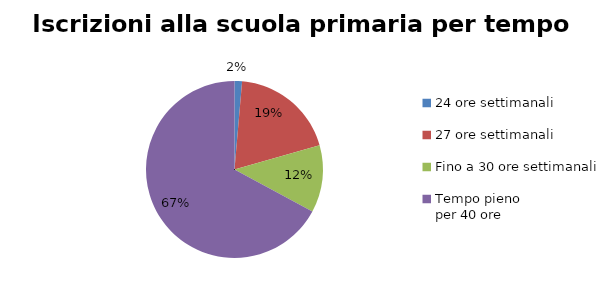
| Category | Series 1 | Series 0 |
|---|---|---|
| 24 ore settimanali | 805 | 805 |
| 27 ore settimanali | 11257 | 11257 |
| Fino a 30 ore settimanali | 7215 | 7215 |
| Tempo pieno 
per 40 ore | 39342 | 39342 |